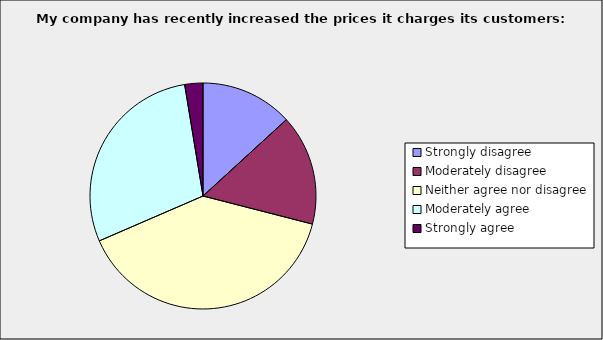
| Category | Series 0 |
|---|---|
| Strongly disagree | 0.132 |
| Moderately disagree | 0.158 |
| Neither agree nor disagree | 0.395 |
| Moderately agree | 0.289 |
| Strongly agree | 0.026 |